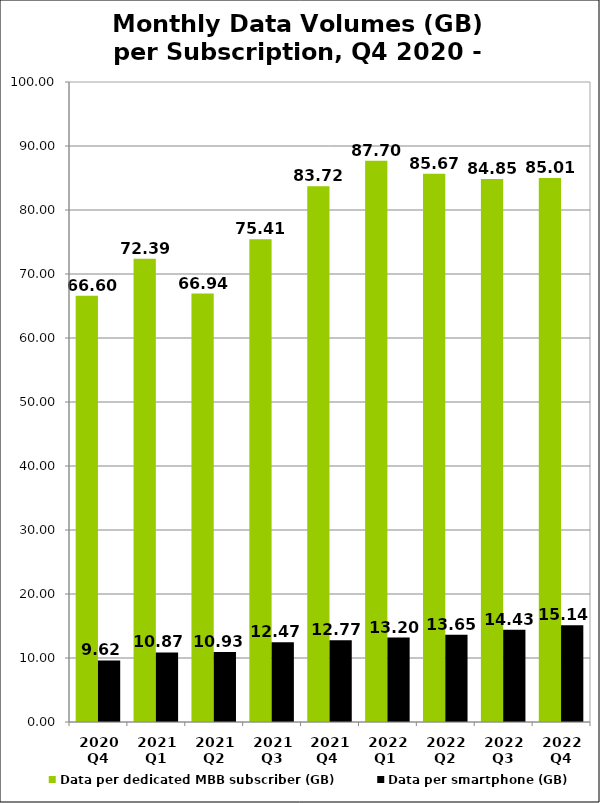
| Category | Data per dedicated MBB subscriber (GB) | Data per smartphone (GB) |
|---|---|---|
| 2020 Q4 | 66.6 | 9.617 |
| 2021 Q1 | 72.393 | 10.869 |
| 2021 Q2 | 66.937 | 10.929 |
| 2021 Q3 | 75.414 | 12.47 |
| 2021 Q4  | 83.723 | 12.771 |
| 2022 Q1  | 87.695 | 13.202 |
| 2022 Q2 | 85.671 | 13.65 |
| 2022 Q3 | 84.854 | 14.433 |
| 2022 Q4 | 85.009 | 15.135 |